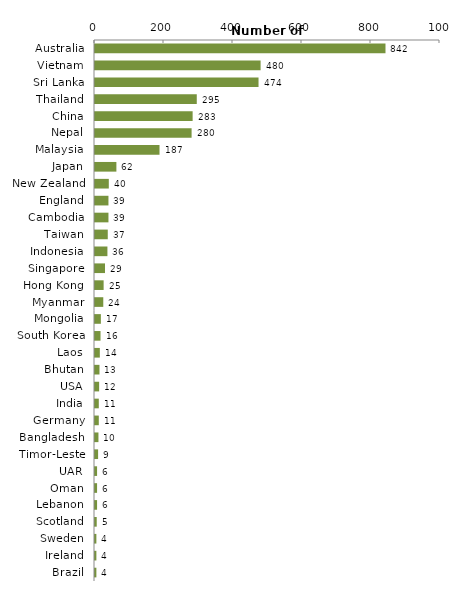
| Category | Series 0 |
|---|---|
| Australia | 842 |
| Vietnam | 480 |
| Sri Lanka | 474 |
| Thailand | 295 |
| China | 283 |
| Nepal | 280 |
| Malaysia | 187 |
| Japan | 62 |
| New Zealand | 40 |
| England | 39 |
| Cambodia | 39 |
| Taiwan | 37 |
| Indonesia | 36 |
| Singapore | 29 |
| Hong Kong | 25 |
| Myanmar | 24 |
| Mongolia | 17 |
| South Korea | 16 |
| Laos | 14 |
| Bhutan | 13 |
| USA | 12 |
| India | 11 |
| Germany | 11 |
| Bangladesh | 10 |
| Timor-Leste | 9 |
| UAR | 6 |
| Oman | 6 |
| Lebanon | 6 |
| Scotland | 5 |
| Sweden | 4 |
| Ireland | 4 |
| Brazil | 4 |